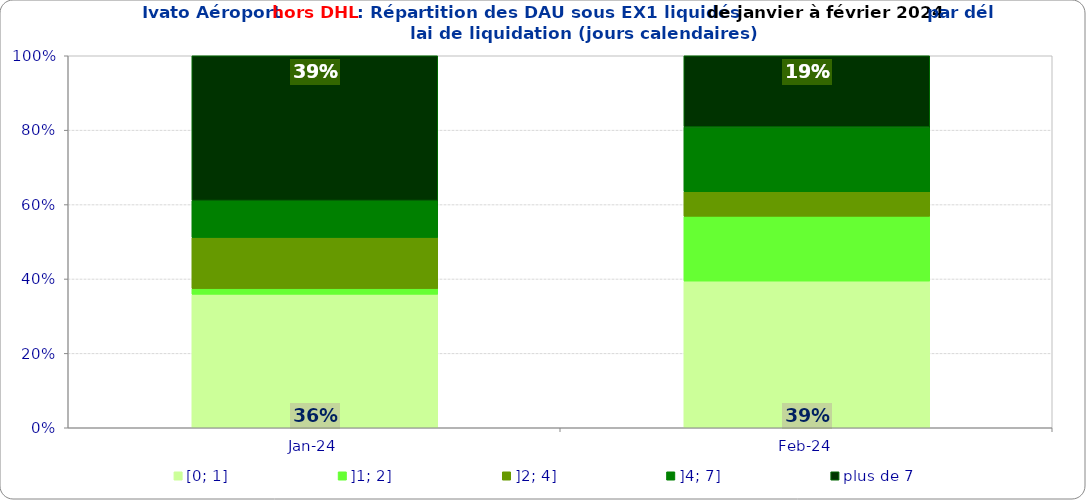
| Category | [0; 1] | ]1; 2] | ]2; 4] | ]4; 7] | plus de 7 |
|---|---|---|---|---|---|
| 2024-01-01 | 0.359 | 0.015 | 0.137 | 0.099 | 0.389 |
| 2024-02-01 | 0.394 | 0.174 | 0.066 | 0.174 | 0.191 |